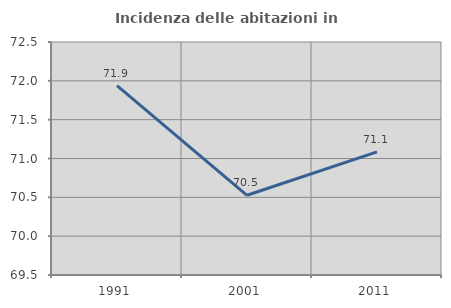
| Category | Incidenza delle abitazioni in proprietà  |
|---|---|
| 1991.0 | 71.937 |
| 2001.0 | 70.526 |
| 2011.0 | 71.084 |